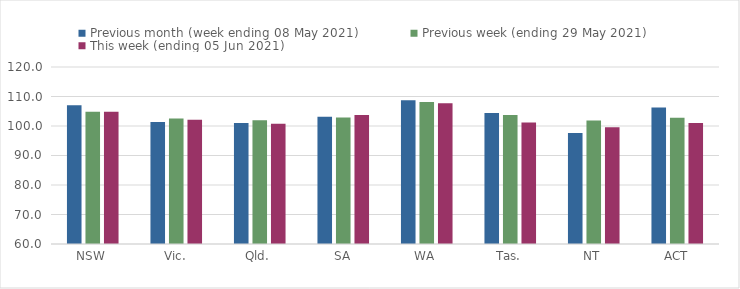
| Category | Previous month (week ending 08 May 2021) | Previous week (ending 29 May 2021) | This week (ending 05 Jun 2021) |
|---|---|---|---|
| NSW | 107.05 | 104.84 | 104.84 |
| Vic. | 101.32 | 102.57 | 102.15 |
| Qld. | 101.04 | 101.96 | 100.76 |
| SA | 103.14 | 102.88 | 103.76 |
| WA | 108.73 | 108.13 | 107.72 |
| Tas. | 104.4 | 103.72 | 101.16 |
| NT | 97.63 | 101.84 | 99.57 |
| ACT | 106.29 | 102.8 | 101.01 |